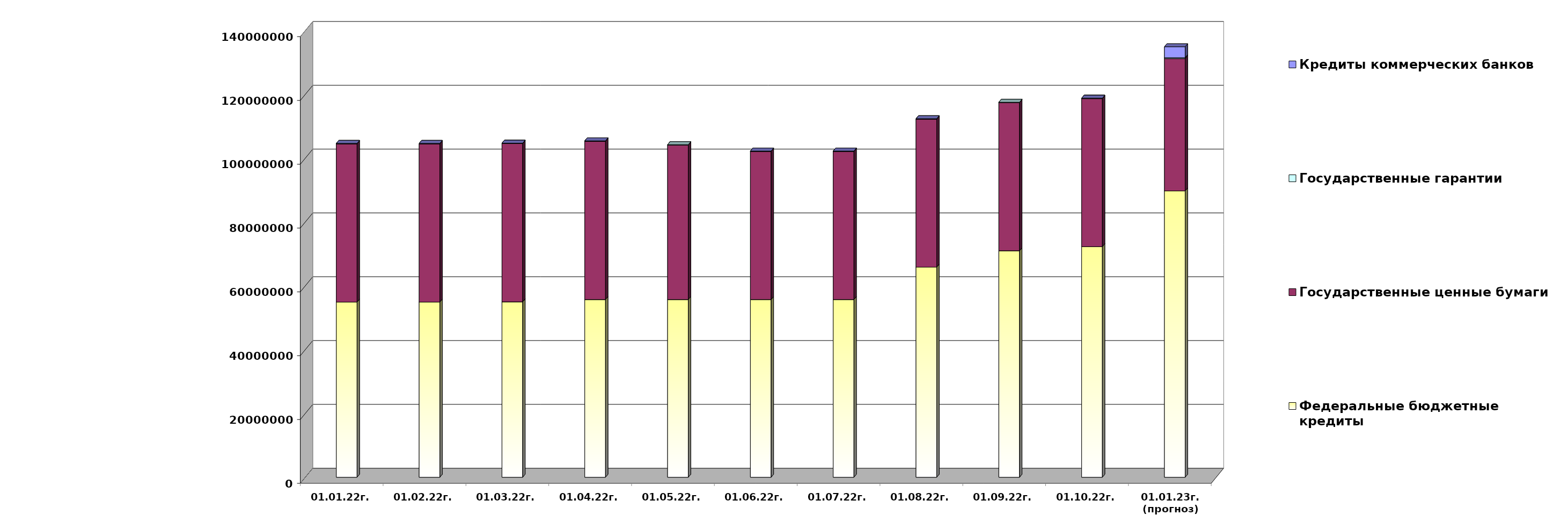
| Category | Федеральные бюджетные кредиты | Государственные ценные бумаги  | Государственные гарантии | Кредиты коммерческих банков |
|---|---|---|---|---|
| 01.01.22г. | 54900618.713 | 49600000 | 141570.67 | 0 |
| 01.02.22г. | 54900618.713 | 49600000 | 139748.87 | 0 |
| 01.03.22г. | 54970753.113 | 49600000 | 139748.87 | 0 |
| 01.04.22г. | 55700753.113 | 49600000 | 139748.87 | 0 |
| 01.05.22г. | 55700753.113 | 48400000 | 138270.964 | 0 |
| 01.06.22г. | 55705077.413 | 46400000 | 138270.964 | 0 |
| 01.07.22г. | 55705077.413 | 46400000 | 138270.964 | 0 |
| 01.08.22г. | 65845099.48 | 46400000 | 134576.199 | 0 |
| 01.09.22г. | 71000838.41 | 46400000 | 134576.199 | 0 |
| 01.10.22г. | 72274148.94 | 46400000 | 134576.199 | 0 |
| 01.01.23г.
(прогноз) | 89741231.3 | 41500000 | 265278.1 | 3434377.3 |